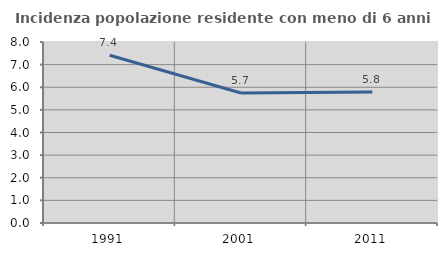
| Category | Incidenza popolazione residente con meno di 6 anni |
|---|---|
| 1991.0 | 7.417 |
| 2001.0 | 5.748 |
| 2011.0 | 5.792 |